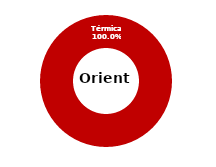
| Category | Oriente |
|---|---|
| Eólica | 0 |
| Hidráulica | 0 |
| Solar | 0 |
| Térmica | 27.625 |